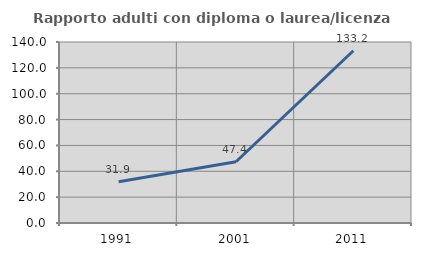
| Category | Rapporto adulti con diploma o laurea/licenza media  |
|---|---|
| 1991.0 | 31.944 |
| 2001.0 | 47.362 |
| 2011.0 | 133.245 |